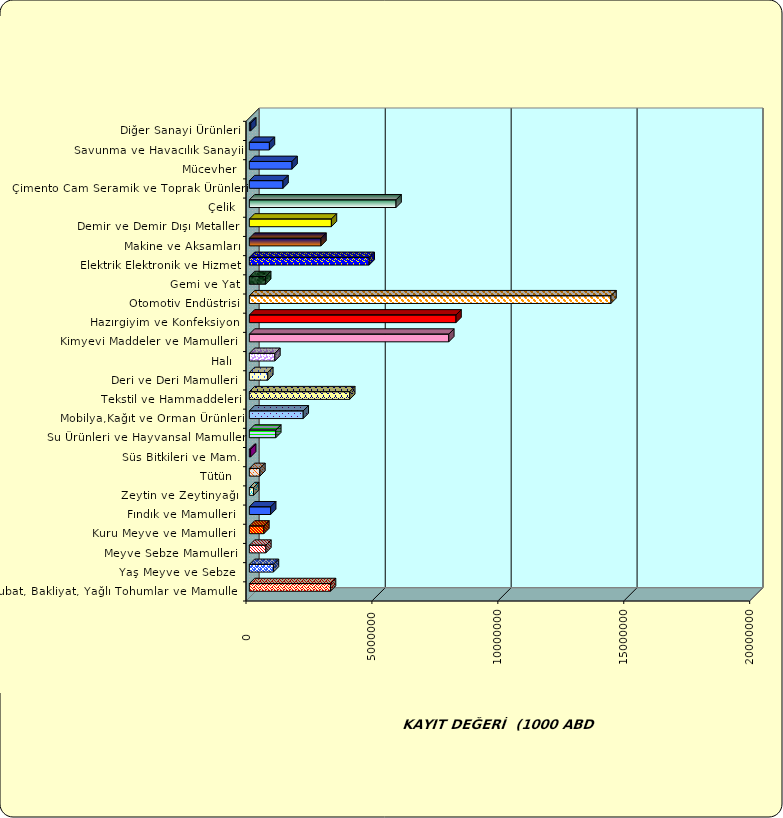
| Category | Series 0 |
|---|---|
|  Hububat, Bakliyat, Yağlı Tohumlar ve Mamulleri  | 3222082.217 |
|  Yaş Meyve ve Sebze   | 955279.886 |
|  Meyve Sebze Mamulleri  | 655728.134 |
|  Kuru Meyve ve Mamulleri   | 575935.462 |
|  Fındık ve Mamulleri  | 845535.396 |
|  Zeytin ve Zeytinyağı  | 164805.967 |
|  Tütün  | 418224.529 |
|  Süs Bitkileri ve Mam. | 50809.451 |
|  Su Ürünleri ve Hayvansal Mamuller | 1049226.963 |
|  Mobilya,Kağıt ve Orman Ürünleri | 2139190.031 |
|  Tekstil ve Hammaddeleri | 3984745.092 |
|  Deri ve Deri Mamulleri  | 732747.674 |
|  Halı  | 1012853.854 |
|  Kimyevi Maddeler ve Mamulleri   | 7919123.987 |
|  Hazırgiyim ve Konfeksiyon  | 8205760.761 |
|  Otomotiv Endüstrisi | 14359485.291 |
|  Gemi ve Yat | 647043.787 |
|  Elektrik Elektronik ve Hizmet | 4758708.438 |
|  Makine ve Aksamları | 2843884.633 |
|  Demir ve Demir Dışı Metaller  | 3257725.867 |
|  Çelik | 5824950.709 |
|  Çimento Cam Seramik ve Toprak Ürünleri | 1335481.177 |
|  Mücevher | 1695393.032 |
|  Savunma ve Havacılık Sanayii | 796887.987 |
|  Diğer Sanayi Ürünleri | 56544.29 |